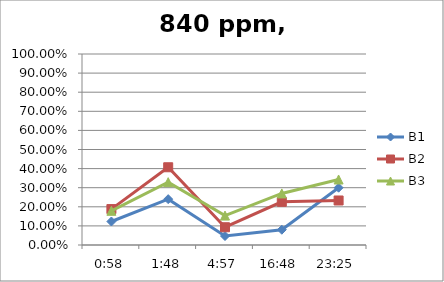
| Category | B1 | B2 | B3 |
|---|---|---|---|
| 0.0402777777777777 | 0.123 | 0.188 | 0.179 |
| 0.0749999999999999 | 0.24 | 0.407 | 0.329 |
| 0.20625 | 0.047 | 0.093 | 0.154 |
| 1900-01-23 16:48:00 | 0.08 | 0.226 | 0.27 |
| 1900-01-23 23:25:00 | 0.3 | 0.233 | 0.343 |